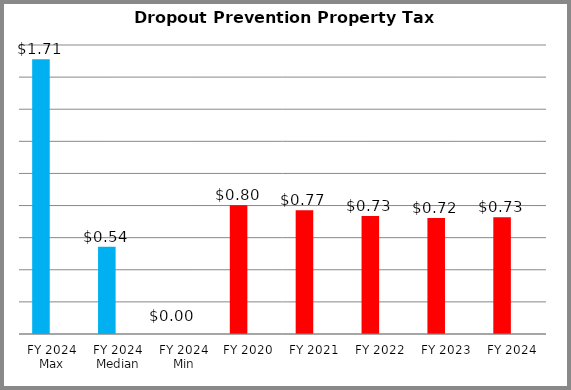
| Category | Series 0 | Series 1 |
|---|---|---|
| FY 2024 Max | 1.711 |  |
| FY 2024 Median | 0.544 |  |
| FY 2024 Min | 0 |  |
| FY 2020 | 0.802 |  |
| FY 2021 | 0.772 |  |
| FY 2022 | 0.735 |  |
| FY 2023 | 0.722 |  |
| FY 2024 | 0.727 |  |